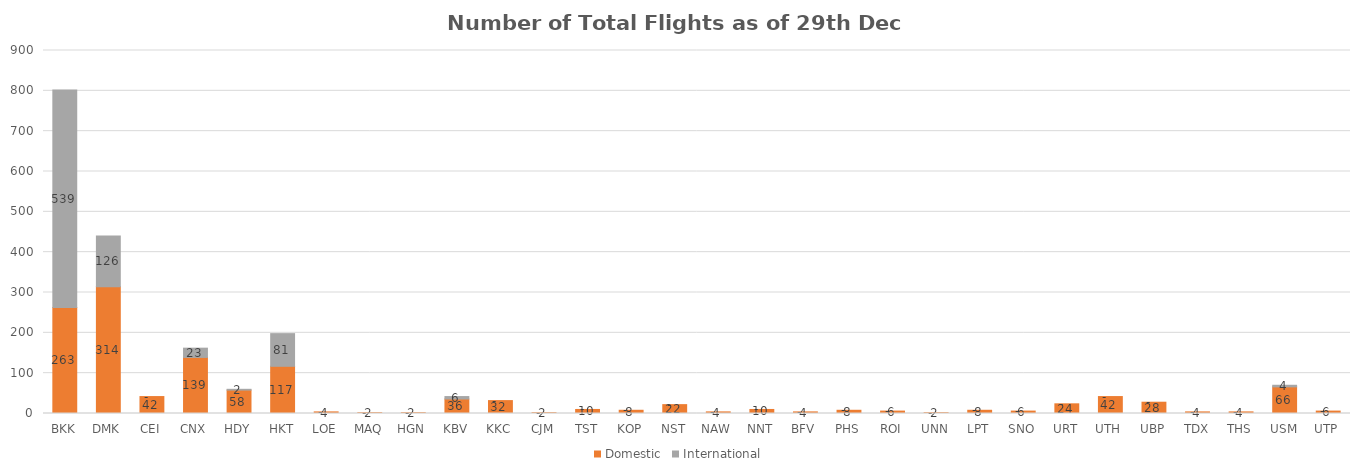
| Category | Domestic | International |
|---|---|---|
| BKK | 263 | 539 |
| DMK | 314 | 126 |
| CEI | 42 | 0 |
| CNX | 139 | 23 |
| HDY | 58 | 2 |
| HKT | 117 | 81 |
| LOE | 4 | 0 |
| MAQ | 2 | 0 |
| HGN | 2 | 0 |
| KBV | 36 | 6 |
| KKC | 32 | 0 |
| CJM | 2 | 0 |
| TST | 10 | 0 |
| KOP | 8 | 0 |
| NST | 22 | 0 |
| NAW | 4 | 0 |
| NNT | 10 | 0 |
| BFV | 4 | 0 |
| PHS | 8 | 0 |
| ROI | 6 | 0 |
| UNN | 2 | 0 |
| LPT | 8 | 0 |
| SNO | 6 | 0 |
| URT | 24 | 0 |
| UTH | 42 | 0 |
| UBP | 28 | 0 |
| TDX | 4 | 0 |
| THS | 4 | 0 |
| USM | 66 | 4 |
| UTP | 6 | 0 |